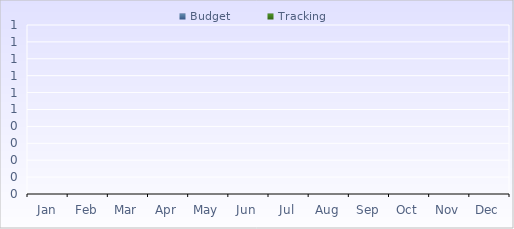
| Category | Budget | Tracking |
|---|---|---|
| Jan | 0 | 0 |
| Feb | 0 | 0 |
| Mar | 0 | 0 |
| Apr | 0 | 0 |
| May | 0 | 0 |
| Jun | 0 | 0 |
| Jul | 0 | 0 |
| Aug | 0 | 0 |
| Sep | 0 | 0 |
| Oct | 0 | 0 |
| Nov | 0 | 0 |
| Dec | 0 | 0 |